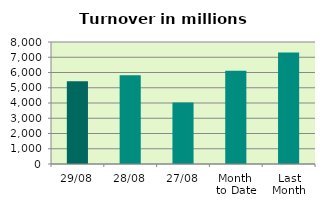
| Category | Series 0 |
|---|---|
| 29/08 | 5419.29 |
| 28/08 | 5825.305 |
| 27/08 | 4035.85 |
| Month 
to Date | 6117.83 |
| Last
Month | 7313.522 |